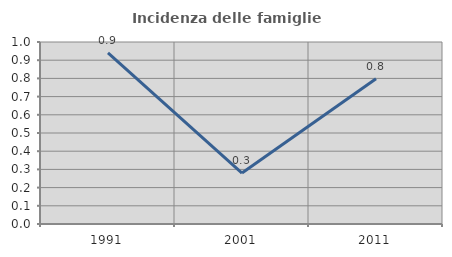
| Category | Incidenza delle famiglie numerose |
|---|---|
| 1991.0 | 0.94 |
| 2001.0 | 0.28 |
| 2011.0 | 0.798 |